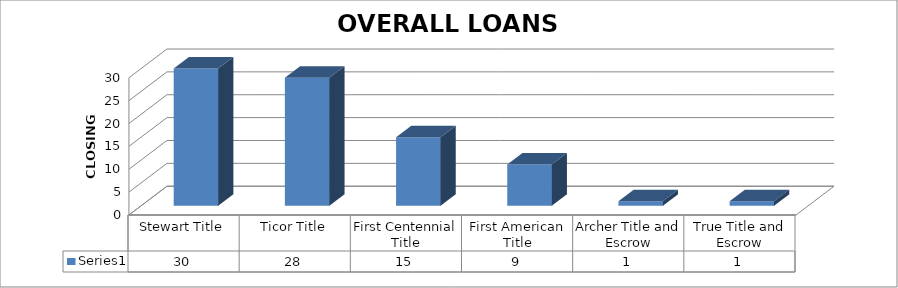
| Category | Series 0 |
|---|---|
| Stewart Title | 30 |
| Ticor Title | 28 |
| First Centennial Title | 15 |
| First American Title | 9 |
| Archer Title and Escrow | 1 |
| True Title and Escrow | 1 |